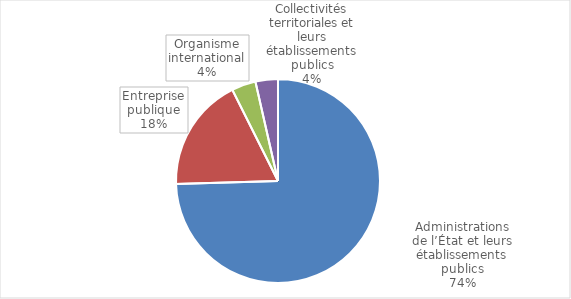
| Category | Hors cadres |
|---|---|
| Administrations de l’État et leurs établissements publics | 272 |
| Entreprise publique | 66 |
| Organisme international | 14 |
| Collectivités territoriales et leurs établissements publics | 13 |